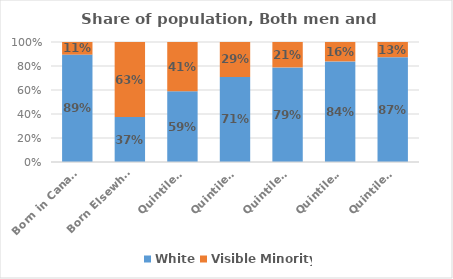
| Category | White | Visible Minority |
|---|---|---|
| Born in Canada | 0.895 | 0.105 |
| Born Elsewhere | 0.374 | 0.626 |
| Quintile 1 | 0.589 | 0.411 |
| Quintile 2 | 0.709 | 0.291 |
| Quintile 3 | 0.788 | 0.212 |
| Quintile 4 | 0.838 | 0.162 |
| Quintile 5 | 0.874 | 0.126 |